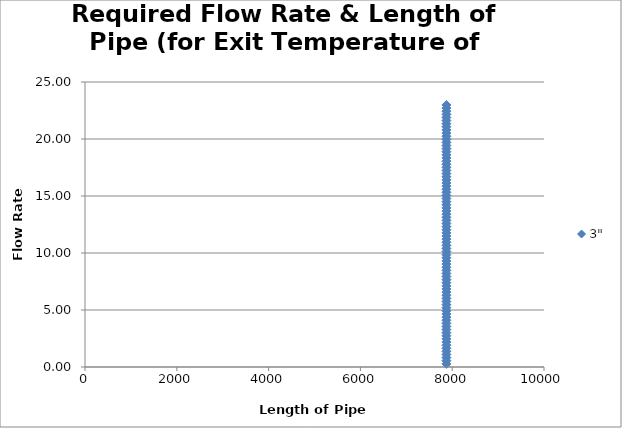
| Category | 3" |
|---|---|
| 7874.01576 | 0.274 |
| 7874.01576 | 0.547 |
| 7874.01576 | 0.821 |
| 7874.01576 | 1.094 |
| 7874.01576 | 1.368 |
| 7874.01576 | 1.642 |
| 7874.01576 | 1.915 |
| 7874.01576 | 2.189 |
| 7874.01576 | 2.463 |
| 7874.01576 | 2.736 |
| 7874.01576 | 3.01 |
| 7874.01576 | 3.283 |
| 7874.01576 | 3.557 |
| 7874.01576 | 3.831 |
| 7874.01576 | 4.104 |
| 7874.01576 | 4.378 |
| 7874.01576 | 4.652 |
| 7874.01576 | 4.925 |
| 7874.01576 | 5.199 |
| 7874.01576 | 5.472 |
| 7874.01576 | 5.746 |
| 7874.01576 | 6.02 |
| 7874.01576 | 6.293 |
| 7874.01576 | 6.567 |
| 7874.01576 | 6.841 |
| 7874.01576 | 7.114 |
| 7874.01576 | 7.388 |
| 7874.01576 | 7.661 |
| 7874.01576 | 7.935 |
| 7874.01576 | 8.209 |
| 7874.01576 | 8.482 |
| 7874.01576 | 8.756 |
| 7874.01576 | 9.03 |
| 7874.01576 | 9.303 |
| 7874.01576 | 9.577 |
| 7874.01576 | 9.85 |
| 7874.01576 | 10.124 |
| 7874.01576 | 10.398 |
| 7874.01576 | 10.671 |
| 7874.01576 | 10.945 |
| 7874.01576 | 11.219 |
| 7874.01576 | 11.492 |
| 7874.01576 | 11.766 |
| 7874.01576 | 12.039 |
| 7874.01576 | 12.313 |
| 7874.01576 | 12.587 |
| 7874.01576 | 12.86 |
| 7874.01576 | 13.134 |
| 7874.01576 | 13.407 |
| 7874.01576 | 13.681 |
| 7874.01576 | 13.955 |
| 7874.01576 | 14.228 |
| 7874.01576 | 14.502 |
| 7874.01576 | 14.776 |
| 7874.01576 | 15.049 |
| 7874.01576 | 15.323 |
| 7874.01576 | 15.596 |
| 7874.01576 | 15.87 |
| 7874.01576 | 16.144 |
| 7874.01576 | 16.417 |
| 7874.01576 | 16.691 |
| 7874.01576 | 16.965 |
| 7874.01576 | 17.238 |
| 7874.01576 | 17.512 |
| 7874.01576 | 17.785 |
| 7874.01576 | 18.059 |
| 7874.01576 | 18.333 |
| 7874.01576 | 18.606 |
| 7874.01576 | 18.88 |
| 7874.01576 | 19.154 |
| 7874.01576 | 19.427 |
| 7874.01576 | 19.701 |
| 7874.01576 | 19.974 |
| 7874.01576 | 20.248 |
| 7874.01576 | 20.522 |
| 7874.01576 | 20.795 |
| 7874.01576 | 21.069 |
| 7874.01576 | 21.343 |
| 7874.01576 | 21.616 |
| 7874.01576 | 21.89 |
| 7874.01576 | 22.163 |
| 7874.01576 | 22.437 |
| 7874.01576 | 22.711 |
| 7874.01576 | 22.984 |